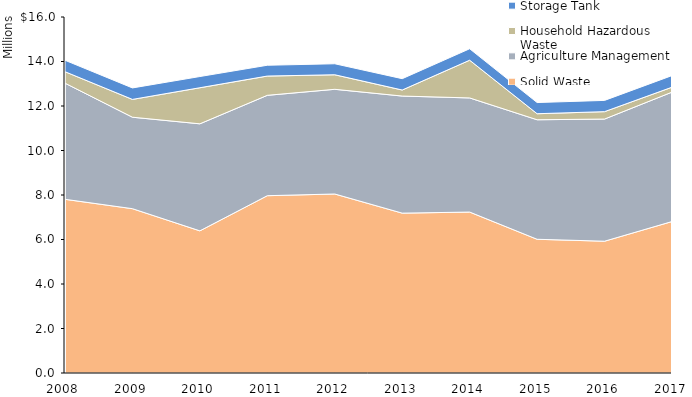
| Category | Solid Waste | Agriculture Management | Household Hazardous Waste | Storage Tank |
|---|---|---|---|---|
| 2008.0 | 7806570 | 5220148 | 514819 | 514437 |
| 2009.0 | 7385240 | 4110622 | 801067 | 515181 |
| 2010.0 | 6388345 | 4811060 | 1621209 | 504327 |
| 2011.0 | 7968735 | 4511238 | 865802 | 485791 |
| 2012.0 | 8045169 | 4705044 | 653790 | 494322 |
| 2013.0 | 7185062 | 5262229 | 271406 | 508858 |
| 2014.0 | 7233747 | 5128759 | 1695495 | 514424 |
| 2015.0 | 6010392.37 | 5371108 | 271197 | 502725 |
| 2016.0 | 5922924 | 5490501 | 332888 | 505685 |
| 2017.0 | 6806900 | 5816042 | 222124 | 522403 |